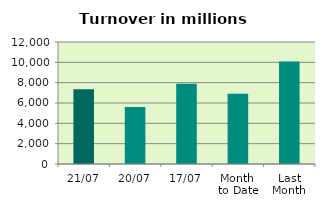
| Category | Series 0 |
|---|---|
| 21/07 | 7342.264 |
| 20/07 | 5616.955 |
| 17/07 | 7901.003 |
| Month 
to Date | 6918.37 |
| Last
Month | 10085.686 |